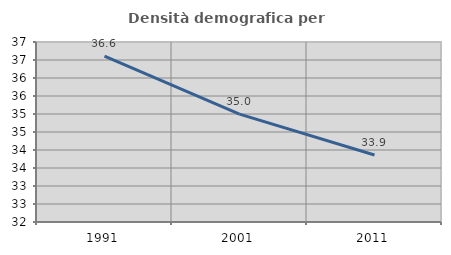
| Category | Densità demografica |
|---|---|
| 1991.0 | 36.605 |
| 2001.0 | 34.996 |
| 2011.0 | 33.862 |